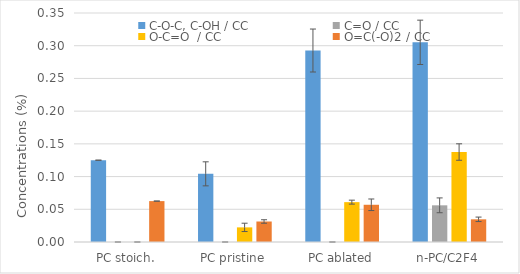
| Category | C-O-C, C-OH / CC | C=O / CC | O-C=O  / CC | O=C(-O)2 / CC |
|---|---|---|---|---|
| PC stoich. | 0.125 | 0 | 0 | 0.062 |
| PC pristine | 0.104 | 0 | 0.022 | 0.031 |
| PC ablated | 0.293 | 0 | 0.061 | 0.057 |
| n-PC/C2F4 | 0.305 | 0.056 | 0.138 | 0.035 |